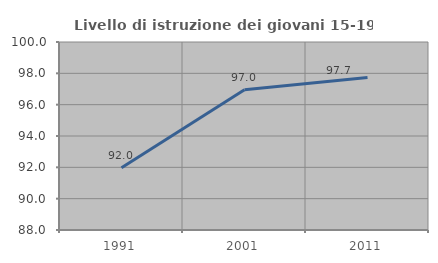
| Category | Livello di istruzione dei giovani 15-19 anni |
|---|---|
| 1991.0 | 91.968 |
| 2001.0 | 96.952 |
| 2011.0 | 97.728 |